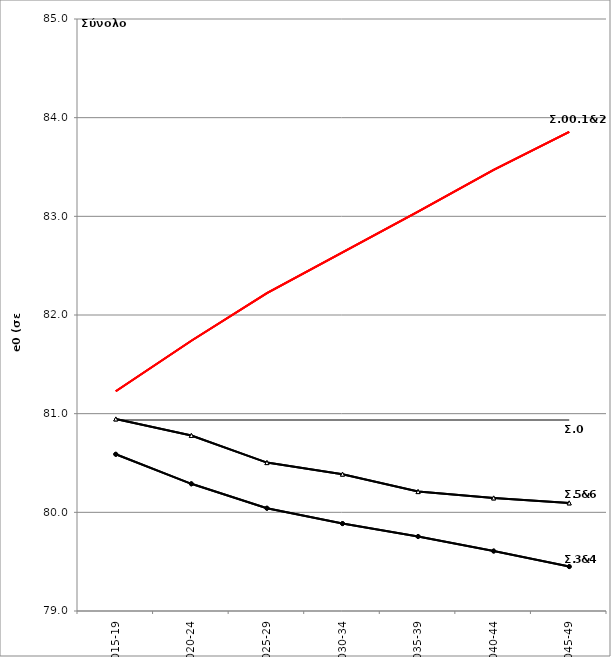
| Category | Σ0.e0 | Σ00.e0 | Σ1.e0 | Σ2.e0 | Σ3.e0 | Σ4.e0 | Σ5.e0 | Σ6.e0 |
|---|---|---|---|---|---|---|---|---|
| 2015-19 | 80.937 | 81.227 | 81.227 | 81.227 | 80.588 | 80.588 | 80.947 | 80.947 |
| 2020-24 | 80.937 | 81.739 | 81.739 | 81.739 | 80.289 | 80.289 | 80.779 | 80.779 |
| 2025-29 | 80.937 | 82.222 | 82.222 | 82.222 | 80.042 | 80.042 | 80.504 | 80.504 |
| 2030-34 | 80.937 | 82.636 | 82.636 | 82.636 | 79.886 | 79.886 | 80.387 | 80.387 |
| 2035-39 | 80.937 | 83.048 | 83.048 | 83.048 | 79.755 | 79.755 | 80.21 | 80.21 |
| 2040-44 | 80.937 | 83.47 | 83.47 | 83.47 | 79.608 | 79.608 | 80.146 | 80.146 |
| 2045-49 | 80.937 | 83.856 | 83.856 | 83.856 | 79.45 | 79.45 | 80.096 | 80.096 |